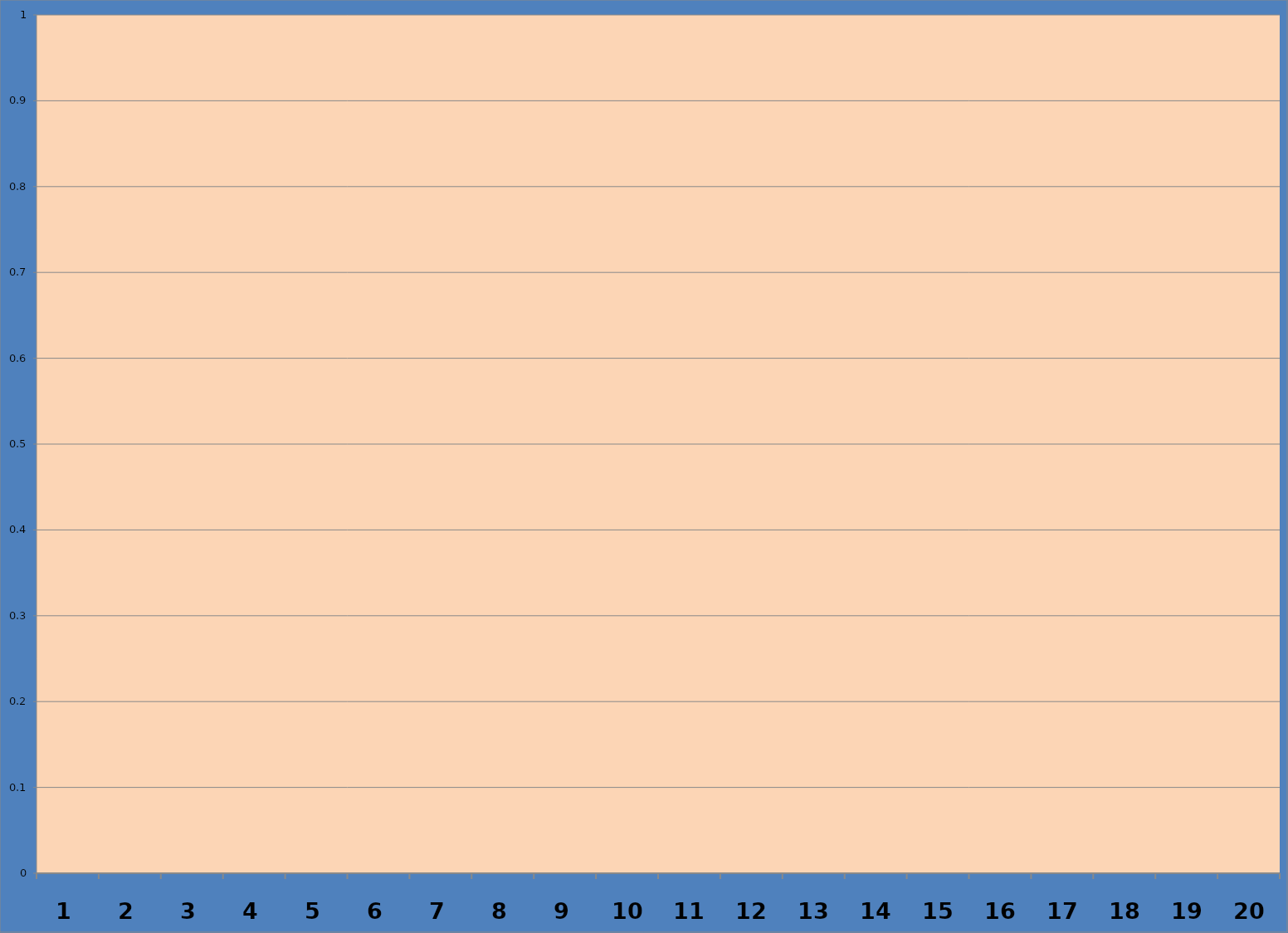
| Category | les neg | les pos |
|---|---|---|
| 0 | 0 | 0 |
| 1 | 0 | 0 |
| 2 | 0 | 0 |
| 3 | 0 | 0 |
| 4 | 0 | 0 |
| 5 | 0 | 0 |
| 6 | 0 | 0 |
| 7 | 0 | 0 |
| 8 | 0 | 0 |
| 9 | 0 | 0 |
| 10 | 0 | 0 |
| 11 | 0 | 0 |
| 12 | 0 | 0 |
| 13 | 0 | 0 |
| 14 | 0 | 0 |
| 15 | 0 | 0 |
| 16 | 0 | 0 |
| 17 | 0 | 0 |
| 18 | 0 | 0 |
| 19 | 0 | 0 |